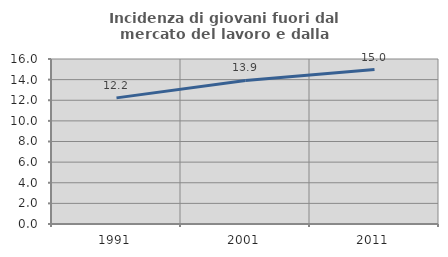
| Category | Incidenza di giovani fuori dal mercato del lavoro e dalla formazione  |
|---|---|
| 1991.0 | 12.23 |
| 2001.0 | 13.924 |
| 2011.0 | 14.973 |